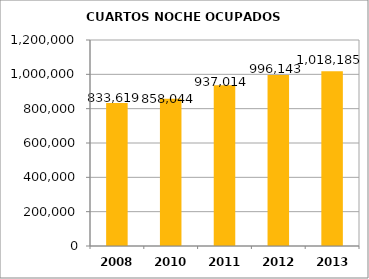
| Category | CUARTOS NOCHE OCUPADOS MENSUAL |
|---|---|
| 2008.0 | 833619 |
| 2010.0 | 858044 |
| 2011.0 | 937014 |
| 2012.0 | 996143 |
| 2013.0 | 1018185 |